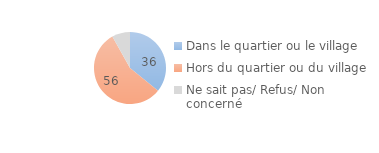
| Category | Series 0 |
|---|---|
| Dans le quartier ou le village | 35.83 |
| Hors du quartier ou du village | 56.03 |
| Ne sait pas/ Refus/ Non concerné | 8.14 |